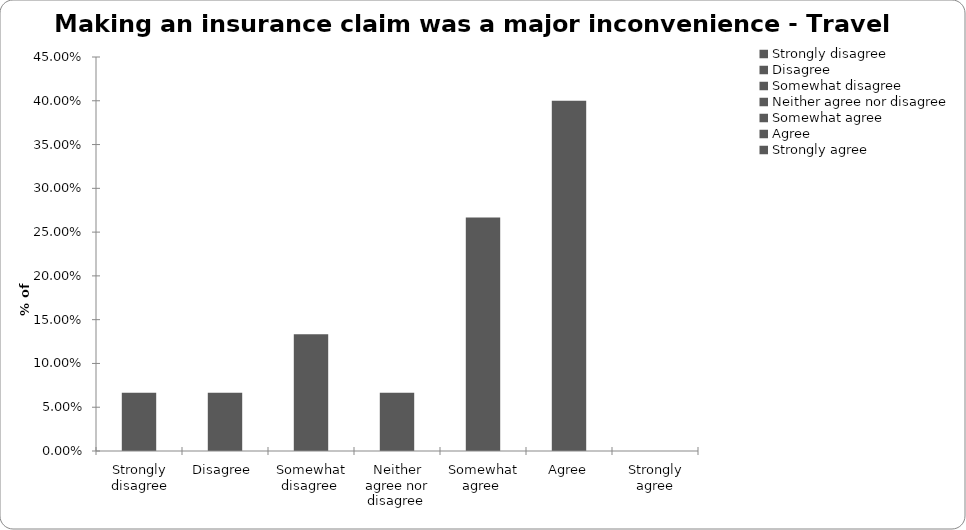
| Category | Series 2 |
|---|---|
| Strongly disagree | 0.067 |
| Disagree  | 0.067 |
| Somewhat disagree  | 0.133 |
| Neither agree nor disagree  | 0.067 |
| Somewhat agree  | 0.267 |
| Agree | 0.4 |
| Strongly agree | 0 |